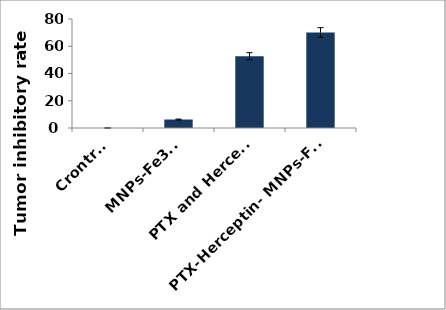
| Category | Series 0 |
|---|---|
| Crontrol | 0 |
| MNPs-Fe3O4 | 6.23 |
| PTX and Herceptin | 52.68 |
| PTX-Herceptin- MNPs-Fe3O4  | 70.14 |